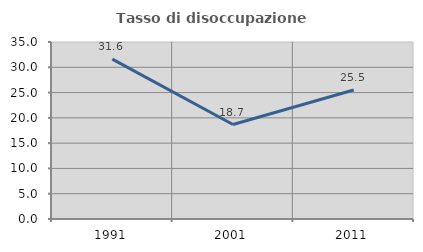
| Category | Tasso di disoccupazione giovanile  |
|---|---|
| 1991.0 | 31.619 |
| 2001.0 | 18.678 |
| 2011.0 | 25.512 |